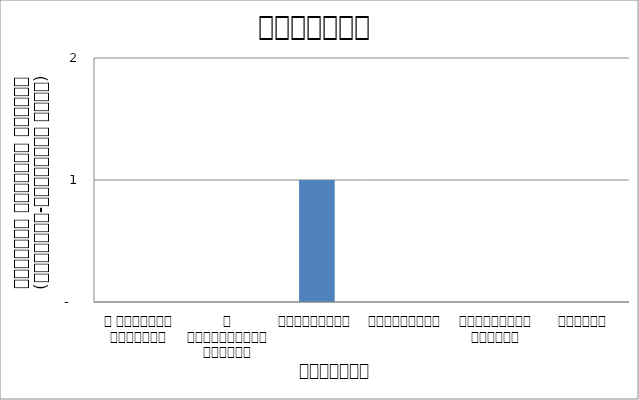
| Category | आन्दोलन |
|---|---|
| द हिमालयन टाइम्स् | 0 |
| द काठमाण्डौं पोस्ट् | 0 |
| रिपब्लिका | 1 |
| कान्तिपुर | 0 |
| अन्नपूर्ण पोस्ट् | 0 |
| नागरिक | 0 |